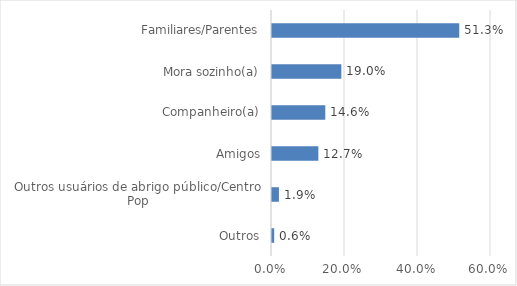
| Category | Series 0 |
|---|---|
| Outros | 0.006 |
| Outros usuários de abrigo público/Centro Pop | 0.019 |
| Amigos | 0.127 |
| Companheiro(a) | 0.146 |
| Mora sozinho(a) | 0.19 |
| Familiares/Parentes | 0.513 |